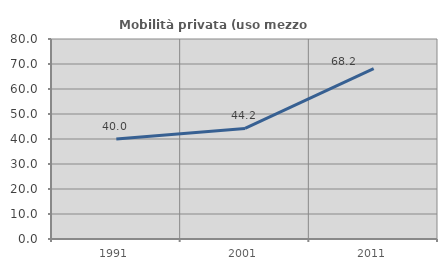
| Category | Mobilità privata (uso mezzo privato) |
|---|---|
| 1991.0 | 40 |
| 2001.0 | 44.231 |
| 2011.0 | 68.182 |